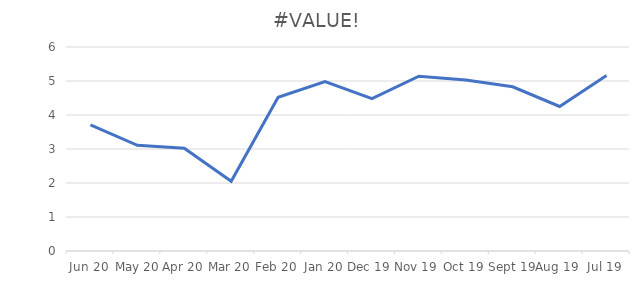
| Category | Close |
|---|---|
| 2020-06-01 | 3.71 |
| 2020-05-01 | 3.11 |
| 2020-04-01 | 3.02 |
| 2020-03-01 | 2.05 |
| 2020-02-01 | 4.52 |
| 2020-01-01 | 4.98 |
| 2019-12-01 | 4.48 |
| 2019-11-01 | 5.14 |
| 2019-10-01 | 5.03 |
| 2019-09-01 | 4.83 |
| 2019-08-01 | 4.25 |
| 2019-07-01 | 5.16 |